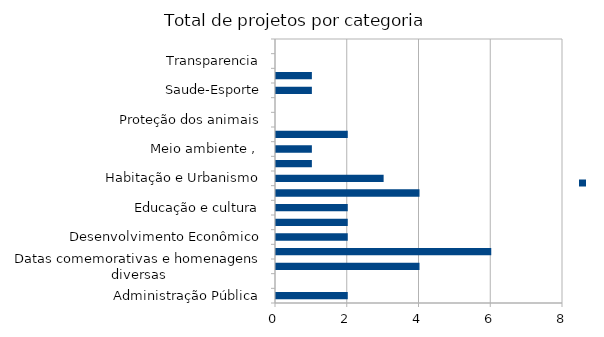
| Category | Series 0 |
|---|---|
| Administração Pública | 2 |
| Combate à corrupção  | 0 |
| Datas comemorativas e homenagens diversas | 4 |
| Denominação de logradouro | 6 |
| Desenvolvimento Econômico | 2 |
| Desenvolvimento Social  | 2 |
| Educação e cultura | 2 |
| Frente parlamentar | 4 |
| Habitação e Urbanismo | 3 |
| Lei Orgânica do Município | 1 |
| Meio ambiente ,  | 1 |
| Mobilidade | 2 |
| Proteção dos animais | 0 |
| Regimento Interno da CMSP | 0 |
| Saude-Esporte | 1 |
| Segurança Pública | 1 |
| Transparencia | 0 |
| Tributação | 0 |